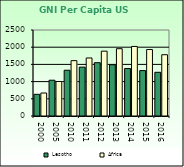
| Category | Lesotho | Africa                        |
|---|---|---|
| 2000.0 | 630 | 668.557 |
| 2005.0 | 1040 | 1002.896 |
| 2010.0 | 1330 | 1608.999 |
| 2011.0 | 1420 | 1686.521 |
| 2012.0 | 1550 | 1885.129 |
| 2013.0 | 1490 | 1956.671 |
| 2014.0 | 1380 | 2022.289 |
| 2015.0 | 1320 | 1932.283 |
| 2016.0 | 1270 | 1781.415 |